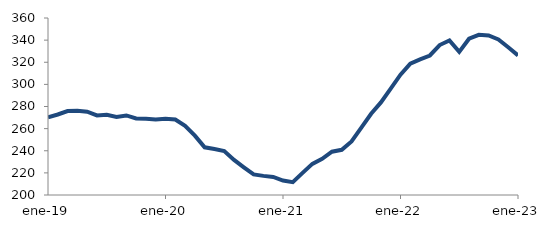
| Category | Series 0 |
|---|---|
| 2019-01-01 | 270.264 |
| 2019-02-01 | 272.765 |
| 2019-03-01 | 275.922 |
| 2019-04-01 | 276.17 |
| 2019-05-01 | 275.323 |
| 2019-06-01 | 271.933 |
| 2019-07-01 | 272.528 |
| 2019-08-01 | 270.617 |
| 2019-09-01 | 271.909 |
| 2019-10-01 | 269.246 |
| 2019-11-01 | 268.873 |
| 2019-12-01 | 268.319 |
| 2020-01-01 | 268.914 |
| 2020-02-01 | 268.233 |
| 2020-03-01 | 262.58 |
| 2020-04-01 | 253.663 |
| 2020-05-01 | 243.088 |
| 2020-06-01 | 241.541 |
| 2020-07-01 | 239.786 |
| 2020-08-01 | 231.766 |
| 2020-09-01 | 225.047 |
| 2020-10-01 | 218.571 |
| 2020-11-01 | 217.286 |
| 2020-12-01 | 216.368 |
| 2021-01-01 | 213.087 |
| 2021-02-01 | 211.643 |
| 2021-03-01 | 220.04 |
| 2021-04-01 | 228.12 |
| 2021-05-01 | 232.717 |
| 2021-06-01 | 239.097 |
| 2021-07-01 | 240.846 |
| 2021-08-01 | 248.449 |
| 2021-09-01 | 260.934 |
| 2021-10-01 | 273.441 |
| 2021-11-01 | 283.683 |
| 2021-12-01 | 296.134 |
| 2022-01-01 | 308.804 |
| 2022-02-01 | 318.726 |
| 2022-03-01 | 322.592 |
| 2022-04-01 | 326.114 |
| 2022-05-01 | 335.557 |
| 2022-06-01 | 339.684 |
| 2022-07-01 | 329.357 |
| 2022-08-01 | 341.293 |
| 2022-09-01 | 344.793 |
| 2022-10-01 | 344.185 |
| 2022-11-01 | 340.608 |
| 2022-12-01 | 333.559 |
| 2023-01-01 | 326.199 |